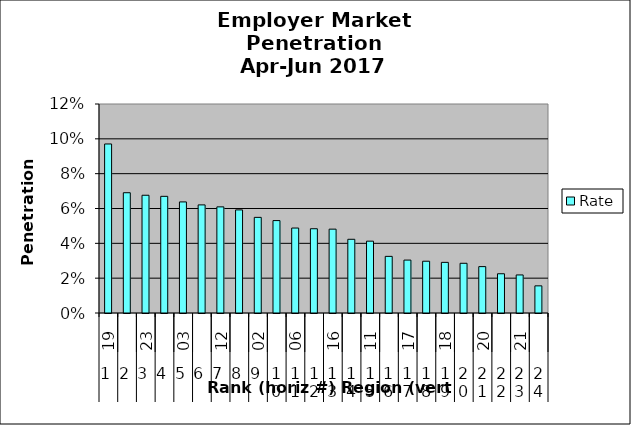
| Category | Rate |
|---|---|
| 0 | 0.097 |
| 1 | 0.069 |
| 2 | 0.068 |
| 3 | 0.067 |
| 4 | 0.064 |
| 5 | 0.062 |
| 6 | 0.061 |
| 7 | 0.059 |
| 8 | 0.055 |
| 9 | 0.053 |
| 10 | 0.049 |
| 11 | 0.048 |
| 12 | 0.048 |
| 13 | 0.042 |
| 14 | 0.041 |
| 15 | 0.033 |
| 16 | 0.03 |
| 17 | 0.03 |
| 18 | 0.029 |
| 19 | 0.029 |
| 20 | 0.027 |
| 21 | 0.023 |
| 22 | 0.022 |
| 23 | 0.016 |